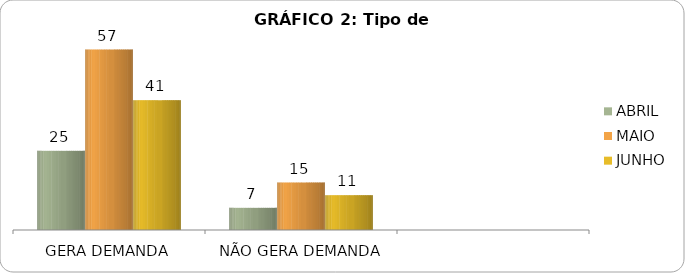
| Category | ABRIL | MAIO | JUNHO |
|---|---|---|---|
| GERA DEMANDA | 25 | 57 | 41 |
| NÃO GERA DEMANDA | 7 | 15 | 11 |